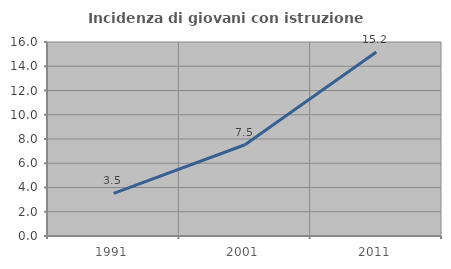
| Category | Incidenza di giovani con istruzione universitaria |
|---|---|
| 1991.0 | 3.514 |
| 2001.0 | 7.525 |
| 2011.0 | 15.17 |